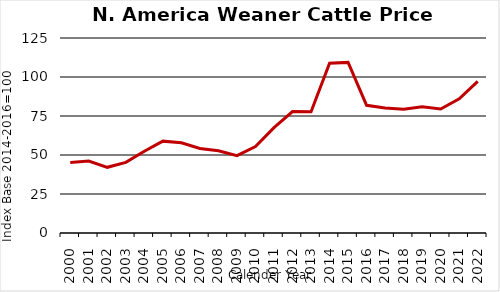
| Category | CA, US |
|---|---|
| 2000.0 | 45.162 |
| 2001.0 | 46.108 |
| 2002.0 | 42.108 |
| 2003.0 | 45.298 |
| 2004.0 | 52.42 |
| 2005.0 | 58.879 |
| 2006.0 | 57.789 |
| 2007.0 | 54.198 |
| 2008.0 | 52.722 |
| 2009.0 | 49.551 |
| 2010.0 | 55.439 |
| 2011.0 | 67.527 |
| 2012.0 | 77.878 |
| 2013.0 | 77.679 |
| 2014.0 | 108.793 |
| 2015.0 | 109.348 |
| 2016.0 | 81.859 |
| 2017.0 | 80.143 |
| 2018.0 | 79.341 |
| 2019.0 | 80.922 |
| 2020.0 | 79.479 |
| 2021.0 | 86.024 |
| 2022.0 | 97.202 |